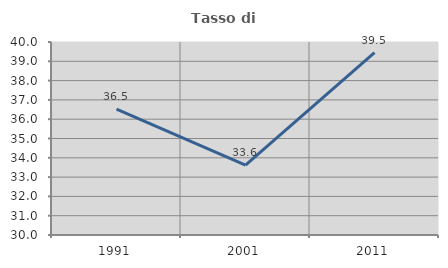
| Category | Tasso di occupazione   |
|---|---|
| 1991.0 | 36.521 |
| 2001.0 | 33.617 |
| 2011.0 | 39.452 |